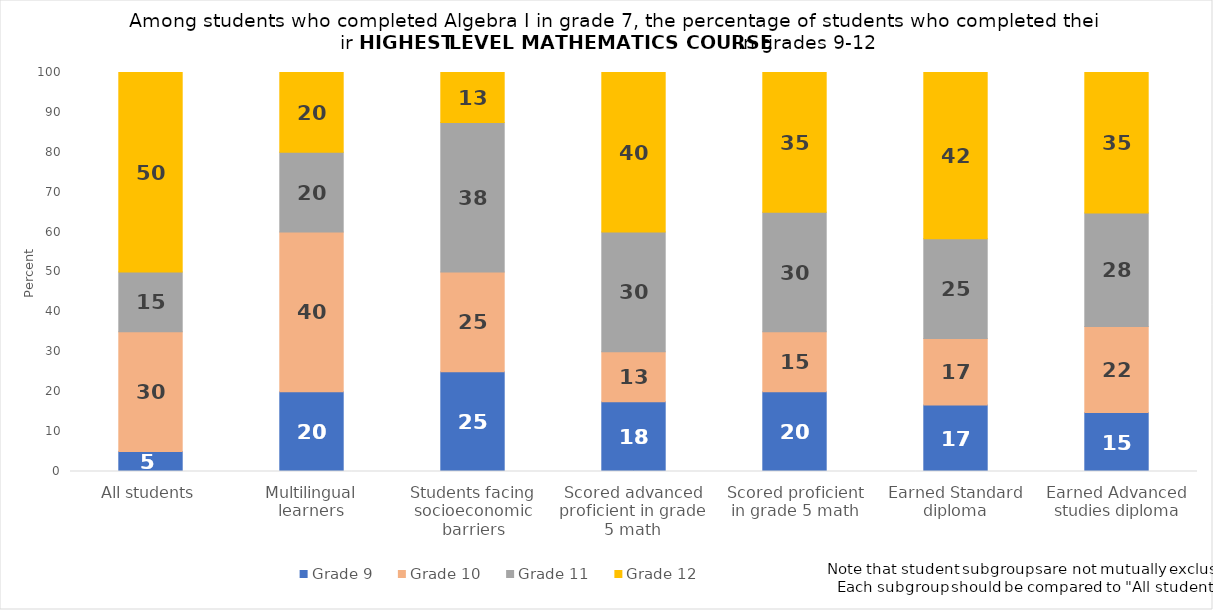
| Category | Grade 9 | Grade 10 | Grade 11 | Grade 12 |
|---|---|---|---|---|
| All students | 5 | 30 | 15 | 50 |
| Multilingual learners | 20 | 40 | 20 | 20 |
| Students facing socioeconomic barriers | 25 | 25 | 37.5 | 12.5 |
| Scored advanced proficient in grade 5 math | 17.5 | 12.5 | 30 | 40 |
| Scored proficient in grade 5 math | 20 | 15 | 30 | 35 |
| Earned Standard diploma | 16.667 | 16.667 | 25 | 41.667 |
| Earned Advanced studies diploma | 14.773 | 21.591 | 28.409 | 35.227 |